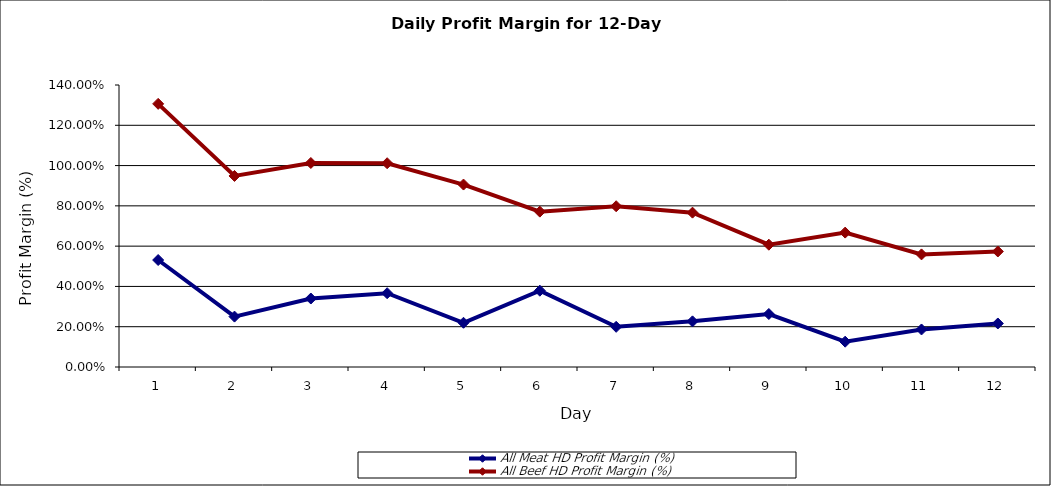
| Category | All Meat HD Profit Margin (%) | All Beef HD Profit Margin (%) |
|---|---|---|
| 0 | 0.531 | 0.775 |
| 1 | 0.25 | 0.698 |
| 2 | 0.34 | 0.673 |
| 3 | 0.366 | 0.645 |
| 4 | 0.22 | 0.686 |
| 5 | 0.379 | 0.392 |
| 6 | 0.199 | 0.599 |
| 7 | 0.227 | 0.54 |
| 8 | 0.263 | 0.344 |
| 9 | 0.126 | 0.542 |
| 10 | 0.186 | 0.373 |
| 11 | 0.216 | 0.357 |